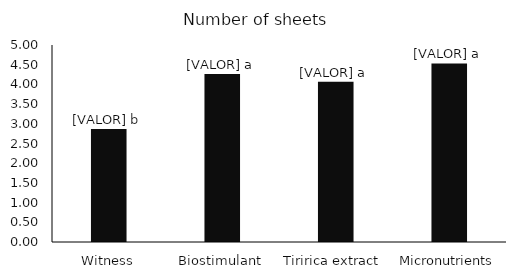
| Category | Series 0 |
|---|---|
| Witness | 2.867 |
| Biostimulant | 4.267 |
| Tiririca extract  | 4.067 |
| Micronutrients | 4.533 |